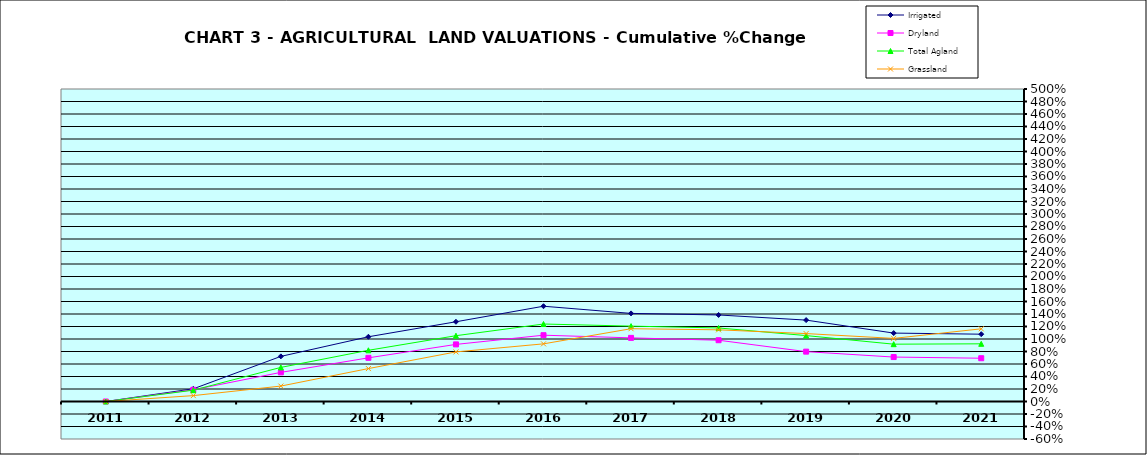
| Category | Irrigated | Dryland | Total Agland | Grassland |
|---|---|---|---|---|
| 2011.0 | 0 | 0 | 0 | 0 |
| 2012.0 | 0.203 | 0.188 | 0.181 | 0.094 |
| 2013.0 | 0.722 | 0.466 | 0.546 | 0.247 |
| 2014.0 | 1.036 | 0.699 | 0.819 | 0.527 |
| 2015.0 | 1.276 | 0.914 | 1.053 | 0.793 |
| 2016.0 | 1.524 | 1.061 | 1.24 | 0.922 |
| 2017.0 | 1.41 | 1.018 | 1.206 | 1.165 |
| 2018.0 | 1.385 | 0.98 | 1.177 | 1.147 |
| 2019.0 | 1.302 | 0.798 | 1.055 | 1.087 |
| 2020.0 | 1.095 | 0.711 | 0.917 | 1.01 |
| 2021.0 | 1.077 | 0.692 | 0.923 | 1.163 |